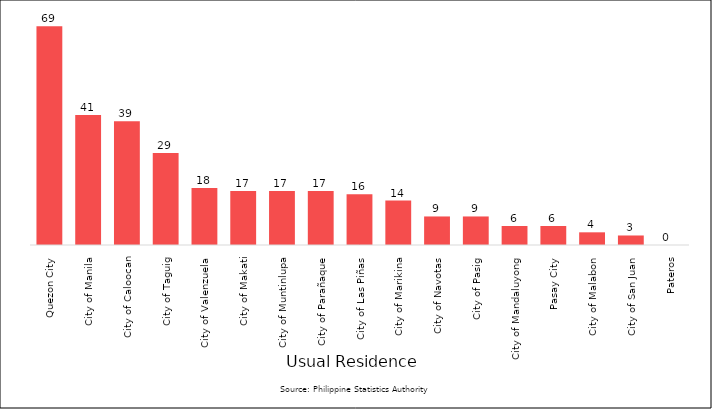
| Category | Series 0 |
|---|---|
|  Quezon City | 69 |
|  City of Manila | 41 |
|  City of Caloocan | 39 |
|  City of Taguig | 29 |
|  City of Valenzuela | 18 |
|  City of Makati | 17 |
|  City of Muntinlupa | 17 |
|  City of Parañaque | 17 |
|  City of Las Piñas | 16 |
|  City of Marikina | 14 |
|  City of Navotas | 9 |
|  City of Pasig | 9 |
|  City of Mandaluyong | 6 |
|  Pasay City | 6 |
|  City of Malabon | 4 |
|  City of San Juan | 3 |
|  Pateros | 0 |